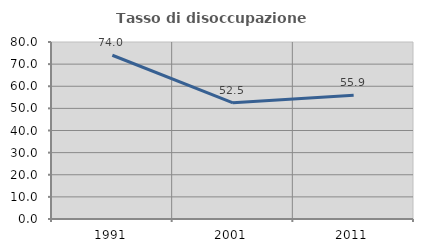
| Category | Tasso di disoccupazione giovanile  |
|---|---|
| 1991.0 | 74.016 |
| 2001.0 | 52.5 |
| 2011.0 | 55.882 |